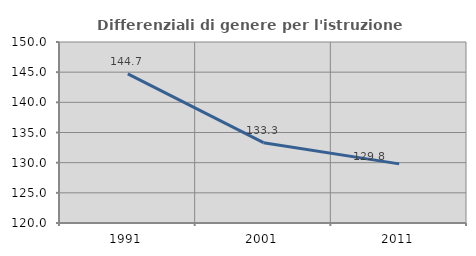
| Category | Differenziali di genere per l'istruzione superiore |
|---|---|
| 1991.0 | 144.719 |
| 2001.0 | 133.315 |
| 2011.0 | 129.8 |